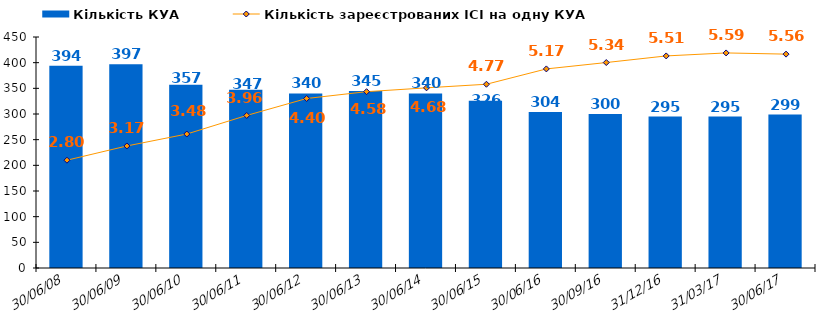
| Category | Кількість КУА |
|---|---|
| 2008-06-30 | 394 |
| 2009-06-30 | 397 |
| 2010-06-30 | 357 |
| 2011-06-30 | 347 |
| 2012-06-30 | 340 |
| 2013-06-30 | 345 |
| 2014-06-30 | 340 |
| 2015-06-30 | 326 |
| 2016-06-30 | 304 |
| 2016-09-30 | 300 |
| 2016-12-31 | 295 |
| 2017-03-31 | 295 |
| 2017-06-30 | 299 |